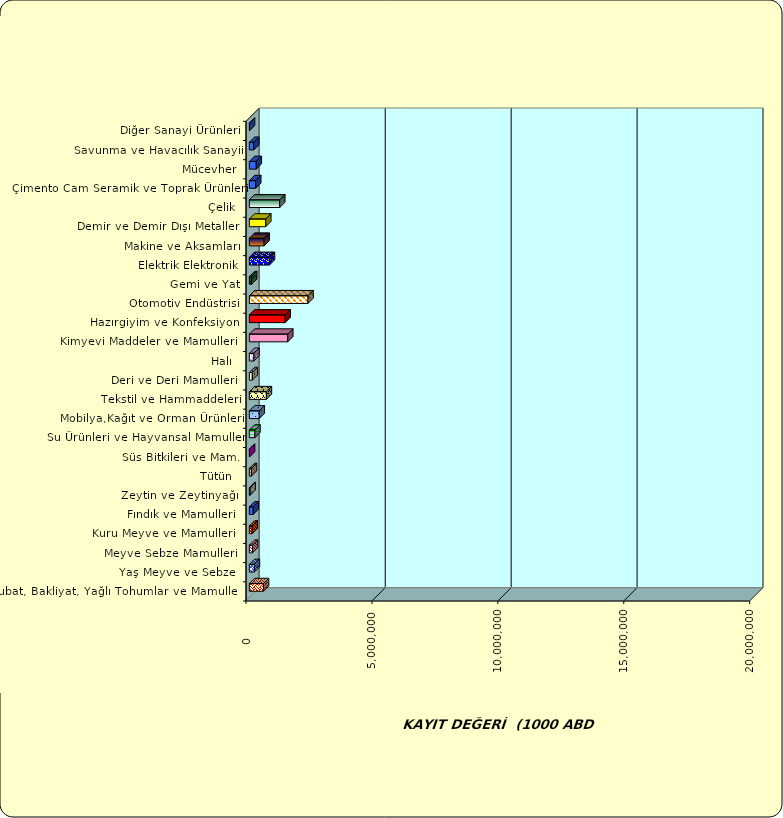
| Category | Series 0 |
|---|---|
|  Hububat, Bakliyat, Yağlı Tohumlar ve Mamulleri  | 561189.321 |
|  Yaş Meyve ve Sebze   | 199837.616 |
|  Meyve Sebze Mamulleri  | 125654.055 |
|  Kuru Meyve ve Mamulleri   | 112591.027 |
|  Fındık ve Mamulleri  | 152898.529 |
|  Zeytin ve Zeytinyağı  | 28880.23 |
|  Tütün  | 82543.429 |
|  Süs Bitkileri ve Mam. | 8448.146 |
|  Su Ürünleri ve Hayvansal Mamuller | 221139.084 |
|  Mobilya,Kağıt ve Orman Ürünleri | 393522.563 |
|  Tekstil ve Hammaddeleri | 676298.562 |
|  Deri ve Deri Mamulleri  | 117337.131 |
|  Halı  | 182745.998 |
|  Kimyevi Maddeler ve Mamulleri   | 1525896.835 |
|  Hazırgiyim ve Konfeksiyon  | 1422006.794 |
|  Otomotiv Endüstrisi | 2330116.161 |
|  Gemi ve Yat | 91916.537 |
|  Elektrik Elektronik | 797994.237 |
|  Makine ve Aksamları | 587415.516 |
|  Demir ve Demir Dışı Metaller  | 651853.984 |
|  Çelik | 1207007.8 |
|  Çimento Cam Seramik ve Toprak Ürünleri | 252274.174 |
|  Mücevher | 274581.315 |
|  Savunma ve Havacılık Sanayii | 175082.548 |
|  Diğer Sanayi Ürünleri | 7320.084 |